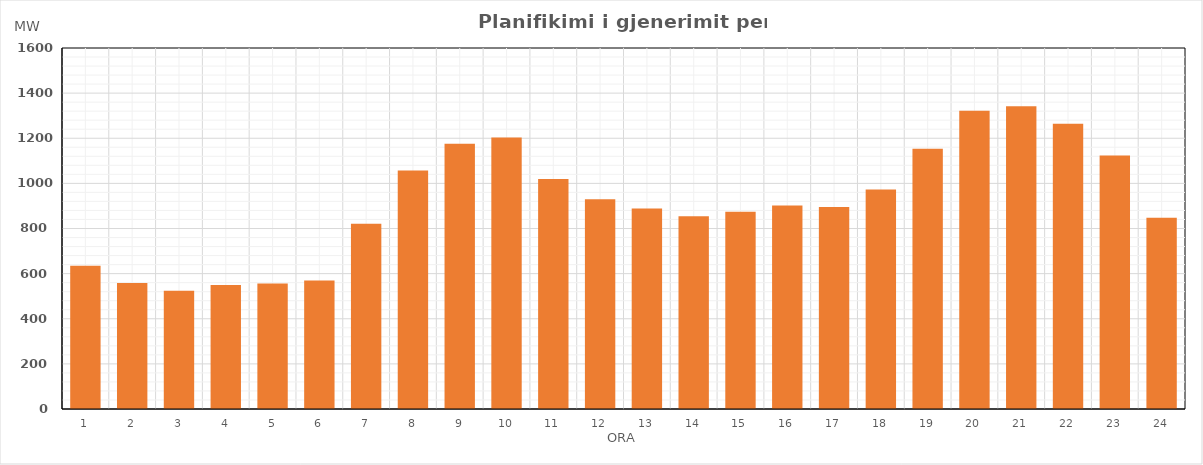
| Category | Max (MW) |
|---|---|
| 0 | 634.96 |
| 1 | 557.97 |
| 2 | 523.98 |
| 3 | 550 |
| 4 | 555.96 |
| 5 | 568.98 |
| 6 | 820.91 |
| 7 | 1056.89 |
| 8 | 1175.89 |
| 9 | 1202.85 |
| 10 | 1018.85 |
| 11 | 929.31 |
| 12 | 888.33 |
| 13 | 854.33 |
| 14 | 873.8 |
| 15 | 901.84 |
| 16 | 895.33 |
| 17 | 973.39 |
| 18 | 1153.5 |
| 19 | 1321.49 |
| 20 | 1341.51 |
| 21 | 1264.56 |
| 22 | 1123.59 |
| 23 | 847.56 |